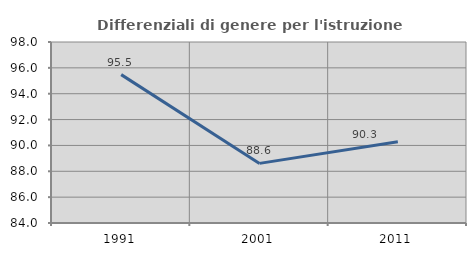
| Category | Differenziali di genere per l'istruzione superiore |
|---|---|
| 1991.0 | 95.477 |
| 2001.0 | 88.611 |
| 2011.0 | 90.285 |